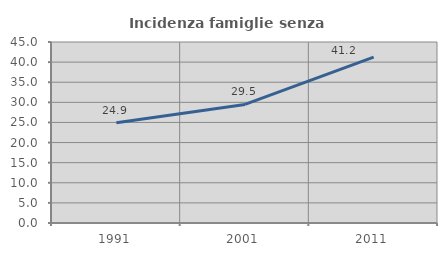
| Category | Incidenza famiglie senza nuclei |
|---|---|
| 1991.0 | 24.922 |
| 2001.0 | 29.481 |
| 2011.0 | 41.223 |